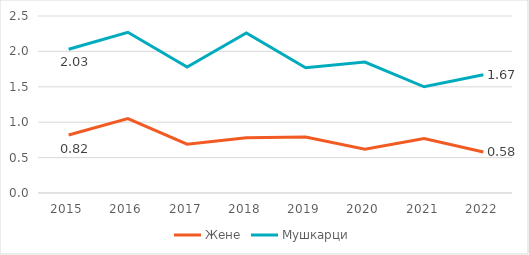
| Category | Жене | Мушкарци |
|---|---|---|
| 2015.0 | 0.82 | 2.03 |
| 2016.0 | 1.05 | 2.27 |
| 2017.0 | 0.69 | 1.78 |
| 2018.0 | 0.78 | 2.26 |
| 2019.0 | 0.79 | 1.77 |
| 2020.0 | 0.62 | 1.85 |
| 2021.0 | 0.77 | 1.5 |
| 2022.0 | 0.58 | 1.67 |